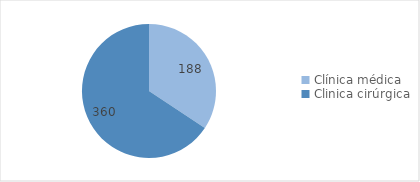
| Category | Series 0 |
|---|---|
| Clínica médica | 188 |
| Clinica cirúrgica | 360 |